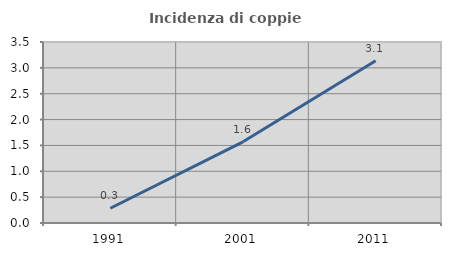
| Category | Incidenza di coppie miste |
|---|---|
| 1991.0 | 0.285 |
| 2001.0 | 1.569 |
| 2011.0 | 3.138 |